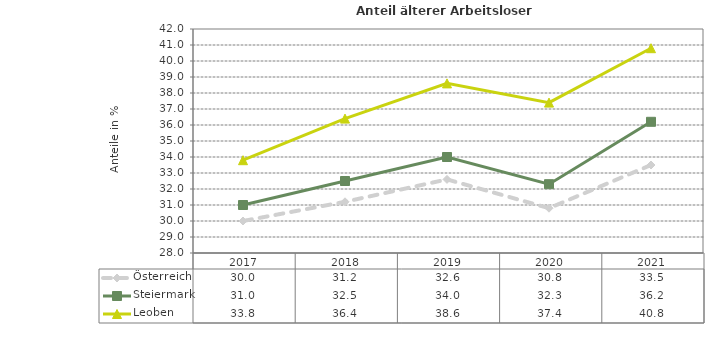
| Category | Österreich | Steiermark | Leoben |
|---|---|---|---|
| 2021.0 | 33.5 | 36.2 | 40.8 |
| 2020.0 | 30.8 | 32.3 | 37.4 |
| 2019.0 | 32.6 | 34 | 38.6 |
| 2018.0 | 31.2 | 32.5 | 36.4 |
| 2017.0 | 30 | 31 | 33.8 |